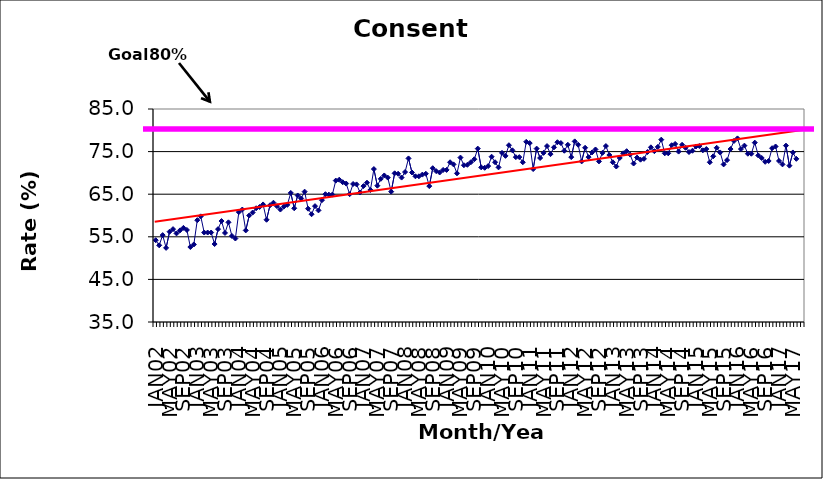
| Category | Series 0 |
|---|---|
| JAN02 | 54.2 |
| FEB02 | 53 |
| MAR02 | 55.4 |
| APR02 | 52.4 |
| MAY02 | 56.2 |
| JUN02 | 56.8 |
| JUL02 | 55.8 |
| AUG02 | 56.5 |
| SEP02 | 57.1 |
| OCT02 | 56.6 |
| NOV02 | 52.6 |
| DEC02 | 53.2 |
| JAN03 | 58.9 |
| FEB03 | 59.8 |
| MAR03 | 56 |
| APR03 | 56 |
| MAY03 | 56 |
| JUN03 | 53.3 |
| JUL03 | 56.8 |
| AUG03 | 58.7 |
| SEP03 | 55.9 |
| OCT03 | 58.4 |
| NOV03 | 55.2 |
| DEC03 | 54.6 |
| JAN04 | 60.8 |
| FEB04 | 61.4 |
| MAR04 | 56.5 |
| APR04 | 60 |
| MAY04 | 60.7 |
| JUN04 | 61.7 |
| JUL04 | 62 |
| AUG04 | 62.6 |
| SEP04 | 59 |
| OCT04 | 62.4 |
| NOV04 | 63 |
| DEC04 | 62.2 |
| JAN05 | 61.4 |
| FEB05 | 62.1 |
| MAR05 | 62.5 |
| APR05 | 65.3 |
| MAY05 | 61.7 |
| JUN05 | 64.7 |
| JUL05 | 64 |
| AUG05 | 65.6 |
| SEP05 | 61.6 |
| OCT05 | 60.3 |
| NOV05 | 62.2 |
| DEC05 | 61.2 |
| JAN06 | 63.6 |
| FEB06 | 65 |
| MAR06 | 64.9 |
| APR06 | 64.9 |
| MAY06 | 68.2 |
| JUN06 | 68.4 |
| JUL06 | 67.8 |
| AUG06 | 67.5 |
| SEP06 | 65 |
| OCT06 | 67.4 |
| NOV06 | 67.3 |
| DEC06 | 65.4 |
| JAN07 | 66.9 |
| FEB07 | 67.7 |
| MAR07 | 66 |
| APR07 | 70.9 |
| MAY07 | 67 |
| JUN07 | 68.6 |
| JUL07 | 69.4 |
| AUG07 | 68.9 |
| SEP07 | 65.6 |
| OCT07 | 69.9 |
| NOV07 | 69.8 |
| DEC07 | 68.9 |
| JAN08 | 70.2 |
| FEB08 | 73.4 |
| MAR08 | 70.1 |
| APR08 | 69.2 |
| MAY08 | 69.2 |
| JUN08 | 69.6 |
| JUL08 | 69.8 |
| AUG08 | 66.9 |
| SEP08 | 71.1 |
| OCT08 | 70.4 |
| NOV08 | 70.1 |
| DEC08 | 70.7 |
| JAN09 | 70.7 |
| FEB09 | 72.5 |
| MAR09 | 72 |
| APR09 | 69.9 |
| MAY09 | 73.6 |
| JUN09 | 71.8 |
| JUL09 | 71.9 |
| AUG09 | 72.5 |
| SEP09 | 73.2 |
| OCT09 | 75.7 |
| NOV09 | 71.3 |
| DEC09 | 71.2 |
| JAN10 | 71.6 |
| FEB10 | 73.8 |
| MAR10 | 72.5 |
| APR10 | 71.3 |
| MAY10 | 74.7 |
| JUN10 | 74 |
| JUL10 | 76.5 |
| AUG10 | 75.3 |
| SEP10 | 73.7 |
| OCT10 | 73.7 |
| NOV10 | 72.5 |
| DEC10 | 77.3 |
| JAN11 | 77 |
| FEB11 | 70.9 |
| MAR11 | 75.7 |
| APR11 | 73.5 |
| MAY11 | 74.7 |
| JUN11 | 76.3 |
| JUL11 | 74.4 |
| AUG11 | 76 |
| SEP11 | 77.2 |
| OCT11 | 77 |
| NOV11 | 75.2 |
| DEC11 | 76.6 |
| JAN12 | 73.7 |
| FEB12 | 77.4 |
| MAR12 | 76.6 |
| APR12 | 72.7 |
| MAY12 | 75.9 |
| JUN12 | 73.7 |
| JUL12 | 74.8 |
| AUG12 | 75.5 |
| SEP12 | 72.7 |
| OCT12 | 74.7 |
| NOV12 | 76.3 |
| DEC12 | 74.2 |
| JAN13 | 72.5 |
| FEB13 | 71.5 |
| MAR13 | 73.5 |
| APR13 | 74.6 |
| MAY13 | 75.1 |
| JUN13 | 74.3 |
| JUL13 | 72.2 |
| AUG13 | 73.6 |
| SEP13 | 73.1 |
| OCT13 | 73.3 |
| NOV13 | 74.9 |
| DEC13 | 76 |
| JAN14 | 75.1 |
| FEB14 | 76.1 |
| MAR14 | 77.8 |
| APR14 | 74.6 |
| MAY14 | 74.6 |
| JUN14 | 76.5 |
| JUL14 | 76.8 |
| AUG14 | 75 |
| SEP14 | 76.6 |
| OCT14 | 75.9 |
| NOV14 | 74.9 |
| DEC14 | 75.2 |
| JAN15 | 76.2 |
| FEB15 | 76.3 |
| MAR15 | 75.3 |
| APR15 | 75.6 |
| MAY15 | 72.5 |
| JUN15 | 73.9 |
| JUL15 | 75.9 |
| AUG15 | 74.8 |
| SEP15 | 72 |
| OCT15 | 73 |
| NOV15 | 75.6 |
| DEC15 | 77.5 |
| JAN16 | 78.1 |
| FEB16 | 75.6 |
| MAR16 | 76.4 |
| APR16 | 74.5 |
| MAY16 | 74.5 |
| JUN16 | 77.1 |
| JUL16 | 74.1 |
| AUG16 | 73.5 |
| SEP16 | 72.6 |
| OCT16 | 72.8 |
| NOV16 | 75.8 |
| DEC16 | 76.2 |
| JAN17 | 72.8 |
| FEB17 | 72 |
| MAR17 | 76.4 |
| APR17 | 71.7 |
| MAY17 | 74.8 |
| JUN17 | 73.3 |